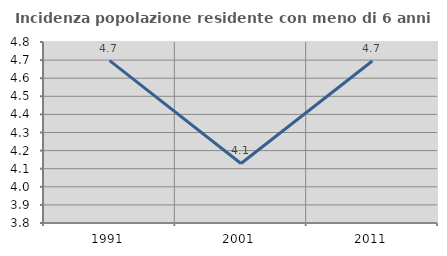
| Category | Incidenza popolazione residente con meno di 6 anni |
|---|---|
| 1991.0 | 4.697 |
| 2001.0 | 4.129 |
| 2011.0 | 4.695 |